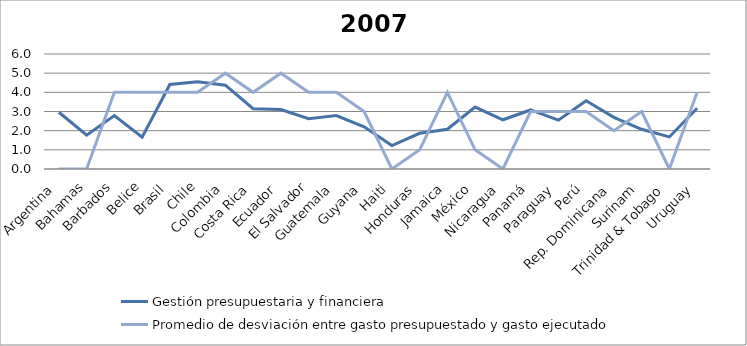
| Category | Gestión presupuestaria y financiera | Promedio de desviación entre gasto presupuestado y gasto ejecutado |
|---|---|---|
| Argentina | 2.96 | 0 |
| Bahamas | 1.767 | 0 |
| Barbados | 2.787 | 4 |
| Belice | 1.66 | 4 |
| Brasil | 4.407 | 4 |
| Chile | 4.547 | 4 |
| Colombia | 4.373 | 5 |
| Costa Rica | 3.147 | 4 |
| Ecuador | 3.107 | 5 |
| El Salvador | 2.62 | 4 |
| Guatemala | 2.791 | 4 |
| Guyana | 2.2 | 3 |
| Haiti | 1.22 | 0 |
| Honduras | 1.861 | 1 |
| Jamaica | 2.073 | 4 |
| México | 3.233 | 1 |
| Nicaragua | 2.568 | 0 |
| Panamá | 3.08 | 3 |
| Paraguay | 2.547 | 3 |
| Perú | 3.56 | 3 |
| Rep. Dominicana | 2.697 | 2 |
| Surinam | 2.071 | 3 |
| Trinidad & Tobago | 1.673 | 0 |
| Uruguay | 3.173 | 4 |